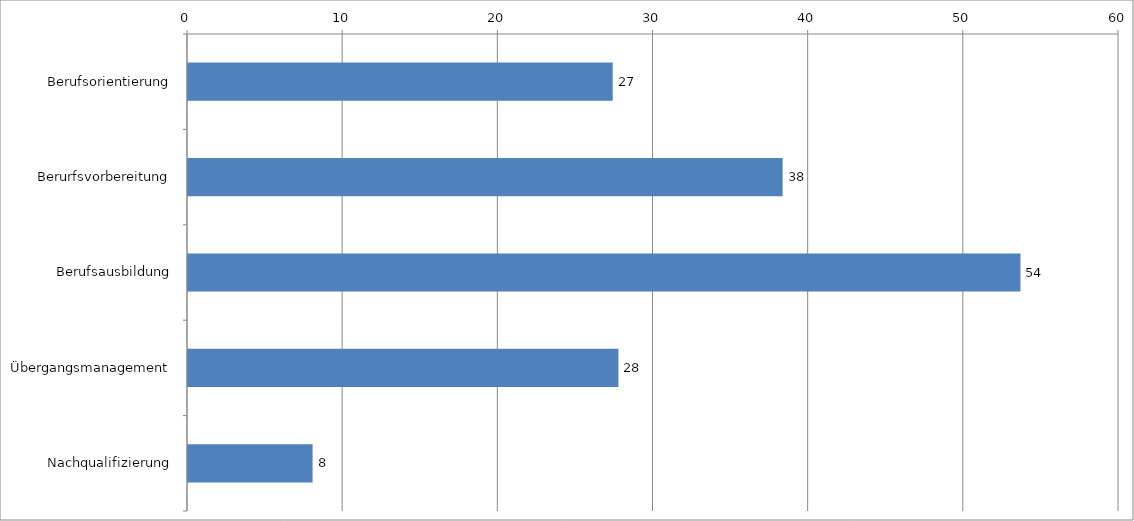
| Category | Series 0 |
|---|---|
| Berufsorientierung | 27.372 |
| Berurfsvorbereitung | 38.321 |
| Berufsausbildung | 53.65 |
| Übergangsmanagement | 27.737 |
| Nachqualifizierung | 8.029 |